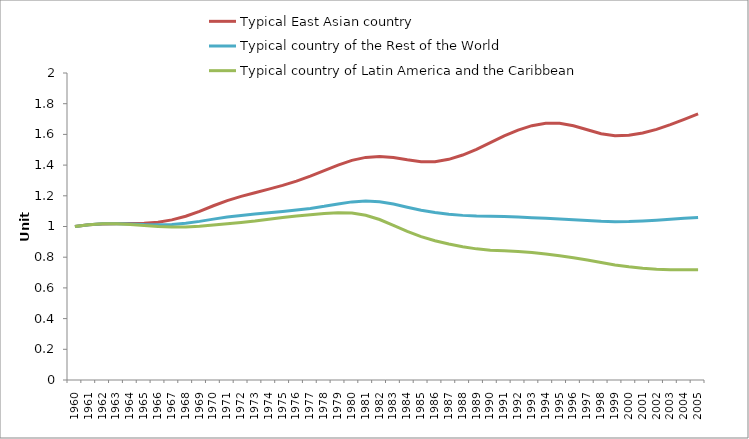
| Category | Typical East Asian country | Typical country of the Rest of the World | Typical country of Latin America and the Caribbean |
|---|---|---|---|
| 1960.0 | 1 | 1 | 1 |
| 1961.0 | 1.011 | 1.012 | 1.012 |
| 1962.0 | 1.016 | 1.018 | 1.018 |
| 1963.0 | 1.019 | 1.019 | 1.018 |
| 1964.0 | 1.019 | 1.016 | 1.014 |
| 1965.0 | 1.021 | 1.012 | 1.007 |
| 1966.0 | 1.028 | 1.011 | 1 |
| 1967.0 | 1.043 | 1.013 | 0.996 |
| 1968.0 | 1.067 | 1.021 | 0.996 |
| 1969.0 | 1.099 | 1.033 | 1.001 |
| 1970.0 | 1.135 | 1.048 | 1.01 |
| 1971.0 | 1.169 | 1.061 | 1.018 |
| 1972.0 | 1.196 | 1.072 | 1.027 |
| 1973.0 | 1.22 | 1.081 | 1.036 |
| 1974.0 | 1.243 | 1.09 | 1.048 |
| 1975.0 | 1.268 | 1.098 | 1.059 |
| 1976.0 | 1.296 | 1.108 | 1.069 |
| 1977.0 | 1.328 | 1.118 | 1.077 |
| 1978.0 | 1.364 | 1.131 | 1.084 |
| 1979.0 | 1.4 | 1.147 | 1.089 |
| 1980.0 | 1.431 | 1.16 | 1.088 |
| 1981.0 | 1.45 | 1.166 | 1.073 |
| 1982.0 | 1.457 | 1.161 | 1.045 |
| 1983.0 | 1.449 | 1.146 | 1.008 |
| 1984.0 | 1.434 | 1.126 | 0.968 |
| 1985.0 | 1.422 | 1.106 | 0.934 |
| 1986.0 | 1.423 | 1.091 | 0.907 |
| 1987.0 | 1.438 | 1.08 | 0.886 |
| 1988.0 | 1.465 | 1.072 | 0.868 |
| 1989.0 | 1.503 | 1.068 | 0.854 |
| 1990.0 | 1.546 | 1.066 | 0.846 |
| 1991.0 | 1.59 | 1.064 | 0.841 |
| 1992.0 | 1.628 | 1.061 | 0.837 |
| 1993.0 | 1.657 | 1.057 | 0.831 |
| 1994.0 | 1.672 | 1.053 | 0.821 |
| 1995.0 | 1.672 | 1.049 | 0.81 |
| 1996.0 | 1.656 | 1.044 | 0.796 |
| 1997.0 | 1.63 | 1.038 | 0.781 |
| 1998.0 | 1.604 | 1.034 | 0.765 |
| 1999.0 | 1.591 | 1.031 | 0.75 |
| 2000.0 | 1.594 | 1.032 | 0.737 |
| 2001.0 | 1.609 | 1.036 | 0.728 |
| 2002.0 | 1.633 | 1.041 | 0.721 |
| 2003.0 | 1.664 | 1.047 | 0.718 |
| 2004.0 | 1.698 | 1.053 | 0.718 |
| 2005.0 | 1.734 | 1.059 | 0.719 |